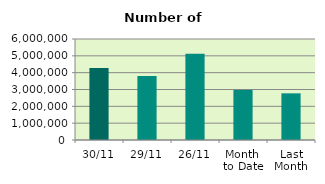
| Category | Series 0 |
|---|---|
| 30/11 | 4270684 |
| 29/11 | 3807574 |
| 26/11 | 5121654 |
| Month 
to Date | 2974168.364 |
| Last
Month | 2771381.143 |